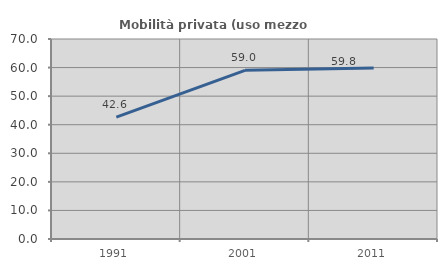
| Category | Mobilità privata (uso mezzo privato) |
|---|---|
| 1991.0 | 42.64 |
| 2001.0 | 59.044 |
| 2011.0 | 59.823 |